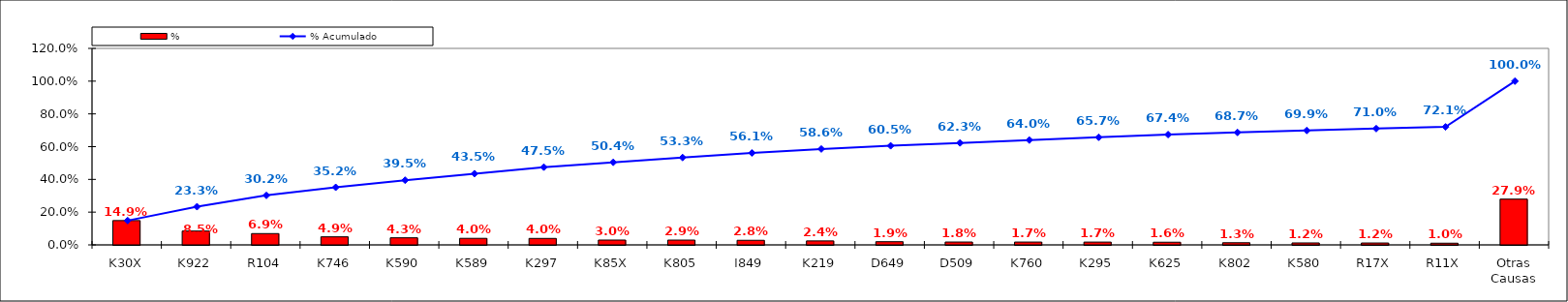
| Category | % |
|---|---|
| K30X | 0.149 |
| K922 | 0.085 |
| R104 | 0.069 |
| K746 | 0.049 |
| K590 | 0.043 |
| K589 | 0.04 |
| K297 | 0.04 |
| K85X | 0.03 |
| K805 | 0.029 |
| I849 | 0.028 |
| K219 | 0.024 |
| D649 | 0.019 |
| D509 | 0.018 |
| K760 | 0.017 |
| K295 | 0.017 |
| K625 | 0.016 |
| K802 | 0.013 |
| K580 | 0.012 |
| R17X | 0.012 |
| R11X | 0.01 |
| Otras Causas | 0.279 |